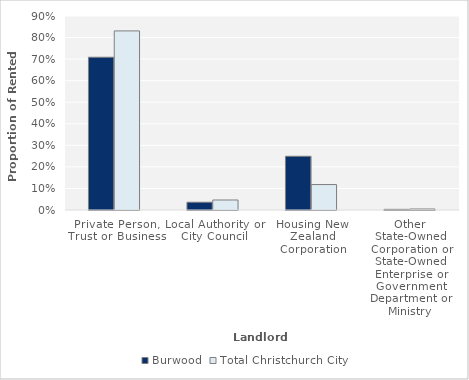
| Category | Burwood | Total Christchurch City |
|---|---|---|
| Private Person, Trust or Business | 0.709 | 0.831 |
| Local Authority or City Council | 0.036 | 0.046 |
| Housing New Zealand Corporation | 0.249 | 0.118 |
| Other State-Owned Corporation or State-Owned Enterprise or Government Department or Ministry | 0.003 | 0.005 |